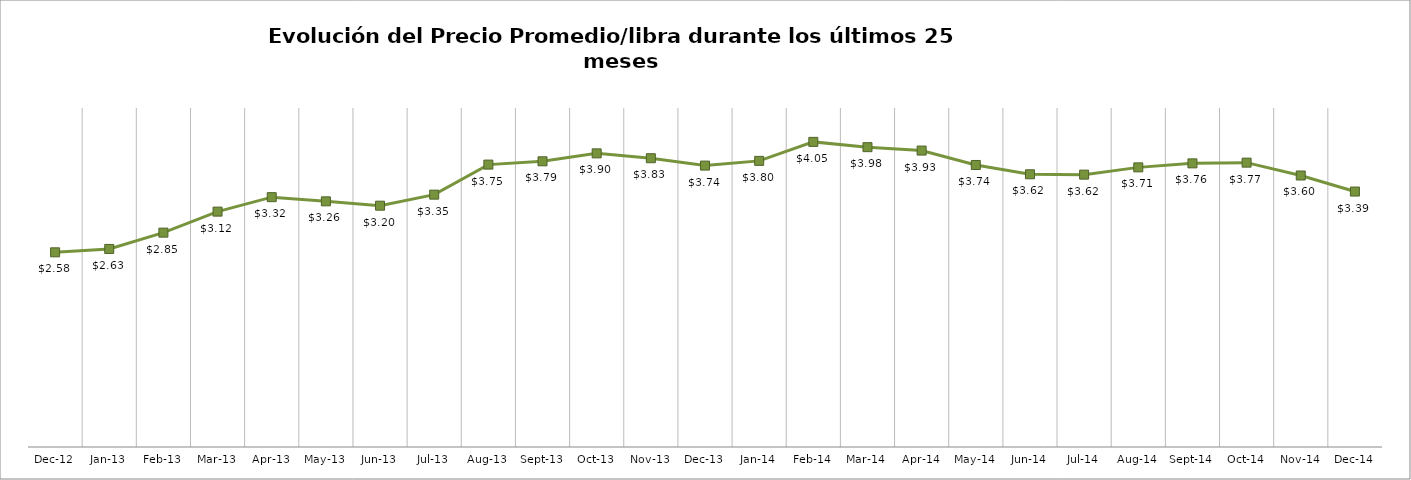
| Category | Series 1 |
|---|---|
| 2012-12-01 | 2.584 |
| 2013-01-01 | 2.629 |
| 2013-02-01 | 2.846 |
| 2013-03-01 | 3.124 |
| 2013-04-01 | 3.316 |
| 2013-05-01 | 3.261 |
| 2013-06-01 | 3.203 |
| 2013-07-01 | 3.35 |
| 2013-08-01 | 3.749 |
| 2013-09-01 | 3.792 |
| 2013-10-01 | 3.898 |
| 2013-11-01 | 3.833 |
| 2013-12-01 | 3.736 |
| 2014-01-01 | 3.798 |
| 2014-02-01 | 4.05 |
| 2014-03-01 | 3.98 |
| 2014-04-01 | 3.935 |
| 2014-05-01 | 3.744 |
| 2014-06-01 | 3.62 |
| 2014-07-01 | 3.615 |
| 2014-08-01 | 3.712 |
| 2014-09-01 | 3.765 |
| 2014-10-01 | 3.775 |
| 2014-11-01 | 3.604 |
| 2014-12-01 | 3.391 |